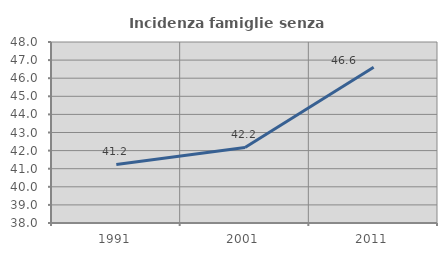
| Category | Incidenza famiglie senza nuclei |
|---|---|
| 1991.0 | 41.232 |
| 2001.0 | 42.174 |
| 2011.0 | 46.606 |